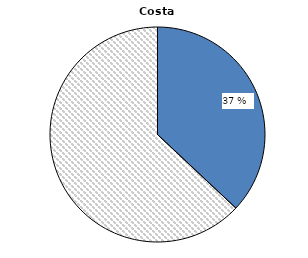
| Category | Costa Rica |
|---|---|
|   Sans contrat de travail formel | 37 |
| Avec un contrat de travail formel | 63 |